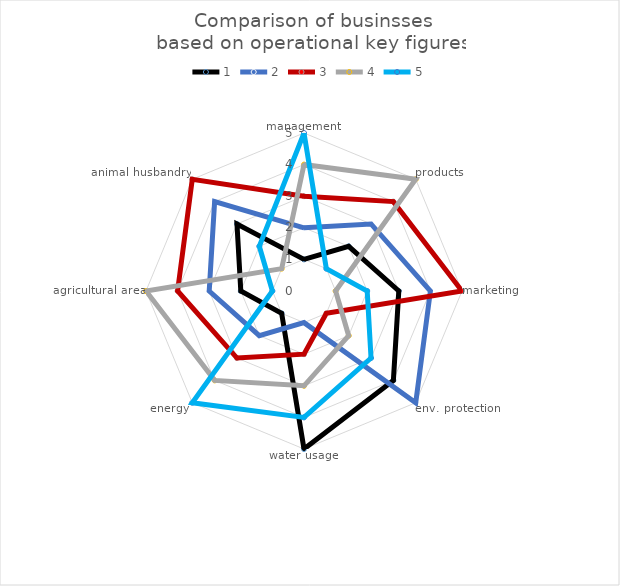
| Category | 1 | 2 | 3 | 4 | 5 |
|---|---|---|---|---|---|
| management | 1 | 2 | 3 | 4 | 5 |
| products | 2 | 3 | 4 | 5 | 1 |
| marketing | 3 | 4 | 5 | 1 | 2 |
| env. protection | 4 | 5 | 1 | 2 | 3 |
| water usage | 5 | 1 | 2 | 3 | 4 |
| energy | 1 | 2 | 3 | 4 | 5 |
| agricultural area | 2 | 3 | 4 | 5 | 1 |
| animal husbandry | 3 | 4 | 5 | 1 | 2 |